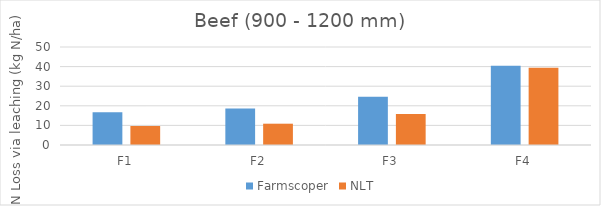
| Category | Farmscoper | NLT |
|---|---|---|
| F1 | 16.684 | 9.68 |
| F2 | 18.668 | 10.87 |
| F3 | 24.621 | 15.83 |
| F4 | 40.496 | 39.41 |